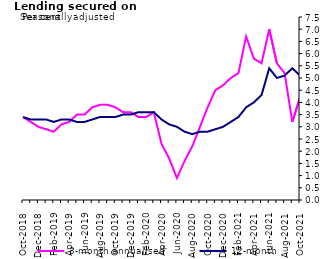
| Category | 3-month annualised | 12-month |
|---|---|---|
| Oct-2018 | 3.4 | 3.4 |
| Nov-2018 | 3.2 | 3.3 |
| Dec-2018 | 3 | 3.3 |
| Jan-2019 | 2.9 | 3.3 |
| Feb-2019 | 2.8 | 3.2 |
| Mar-2019 | 3.1 | 3.3 |
| Apr-2019 | 3.2 | 3.3 |
| May-2019 | 3.5 | 3.2 |
| Jun-2019 | 3.5 | 3.2 |
| Jul-2019 | 3.8 | 3.3 |
| Aug-2019 | 3.9 | 3.4 |
| Sep-2019 | 3.9 | 3.4 |
| Oct-2019 | 3.8 | 3.4 |
| Nov-2019 | 3.6 | 3.5 |
| Dec-2019 | 3.6 | 3.5 |
| Jan-2020 | 3.4 | 3.6 |
| Feb-2020 | 3.4 | 3.6 |
| Mar-2020 | 3.6 | 3.6 |
| Apr-2020 | 2.3 | 3.3 |
| May-2020 | 1.7 | 3.1 |
| Jun-2020 | 0.9 | 3 |
| Jul-2020 | 1.6 | 2.8 |
| Aug-2020 | 2.2 | 2.7 |
| Sep-2020 | 3 | 2.8 |
| Oct-2020 | 3.8 | 2.8 |
| Nov-2020 | 4.5 | 2.9 |
| Dec-2020 | 4.7 | 3 |
| Jan-2021 | 5 | 3.2 |
| Feb-2021 | 5.2 | 3.4 |
| Mar-2021 | 6.7 | 3.8 |
| Apr-2021 | 5.8 | 4 |
| May-2021 | 5.6 | 4.3 |
| Jun-2021 | 7 | 5.4 |
| Jul-2021 | 5.6 | 5 |
| Aug-2021 | 5.2 | 5.1 |
| Sep-2021 | 3.2 | 5.4 |
| Oct-2021 | 4.2 | 5.1 |